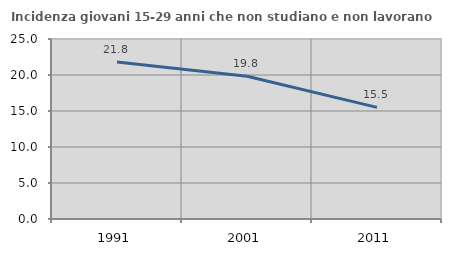
| Category | Incidenza giovani 15-29 anni che non studiano e non lavorano  |
|---|---|
| 1991.0 | 21.818 |
| 2001.0 | 19.836 |
| 2011.0 | 15.508 |